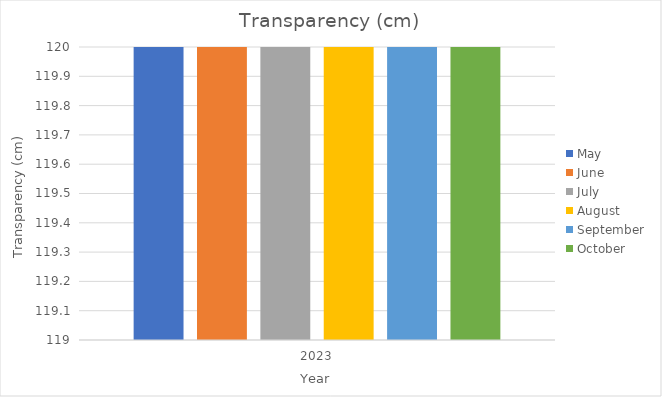
| Category | May | June | July | August | September | October |
|---|---|---|---|---|---|---|
| 2023.0 | 120 | 120 | 120 | 120 | 120 | 120 |